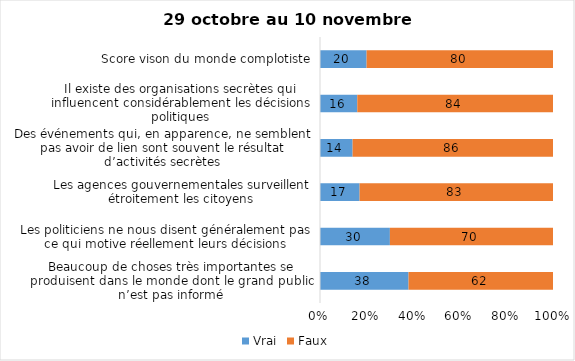
| Category | Vrai | Faux |
|---|---|---|
| Beaucoup de choses très importantes se produisent dans le monde dont le grand public n’est pas informé | 38 | 62 |
| Les politiciens ne nous disent généralement pas ce qui motive réellement leurs décisions | 30 | 70 |
| Les agences gouvernementales surveillent étroitement les citoyens | 17 | 83 |
| Des événements qui, en apparence, ne semblent pas avoir de lien sont souvent le résultat d’activités secrètes | 14 | 86 |
| Il existe des organisations secrètes qui influencent considérablement les décisions politiques | 16 | 84 |
| Score vison du monde complotiste | 20 | 80 |